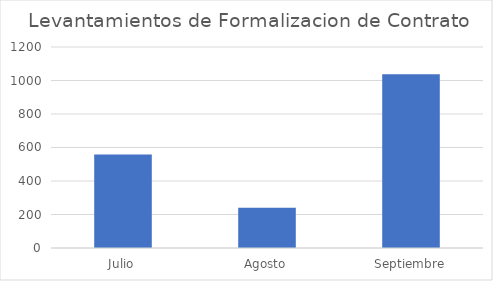
| Category | Levantamientos de Formalizacion de Contrato |
|---|---|
| Julio | 558 |
| Agosto | 240 |
| Septiembre | 1037 |